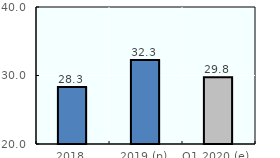
| Category | OECD pension fund assets |
|---|---|
| 2018 | 28.339 |
| 2019 (p) | 32.271 |
| Q1 2020 (e) | 29.757 |